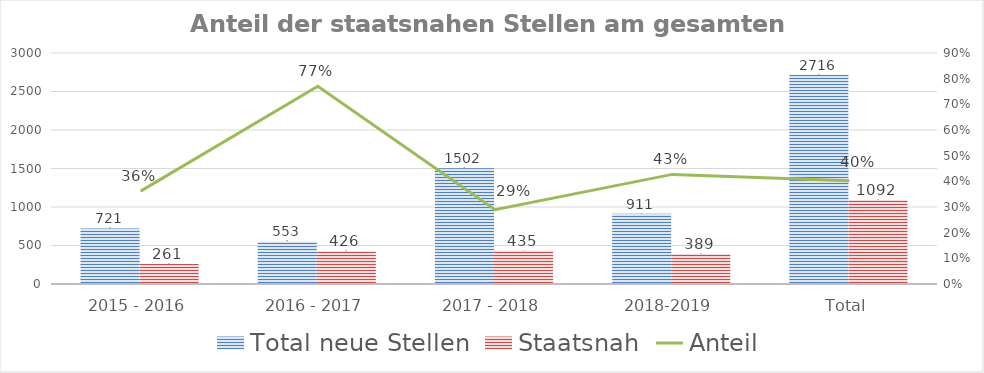
| Category | Total neue Stellen | Staatsnah |
|---|---|---|
| 2015 - 2016 | 721 | 261 |
| 2016 - 2017 | 553 | 426 |
| 2017 - 2018 | 1502 | 435 |
| 2018-2019 | 911 | 389 |
| Total | 2716 | 1092 |